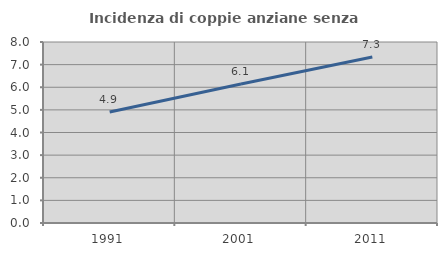
| Category | Incidenza di coppie anziane senza figli  |
|---|---|
| 1991.0 | 4.903 |
| 2001.0 | 6.145 |
| 2011.0 | 7.34 |